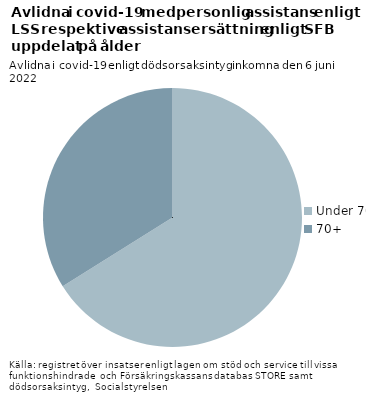
| Category | Ålder |
|---|---|
| Under 70 | 78 |
| 70+ | 40 |